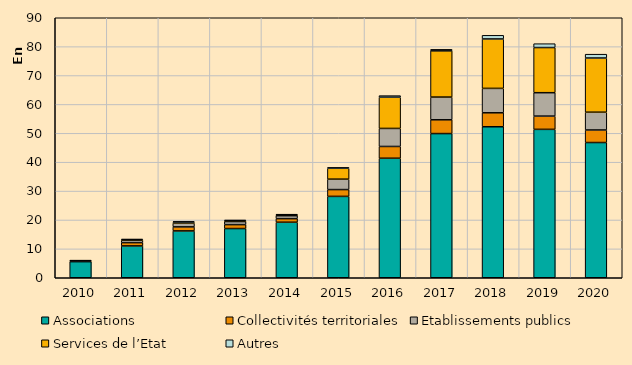
| Category | Associations | Collectivités territoriales | Etablissements publics | Services de l’Etat | Autres |
|---|---|---|---|---|---|
| 2010.0 | 5566 | 251 | 114 | 0 | 77 |
| 2011.0 | 11023 | 1134 | 837 | 180 | 229 |
| 2012.0 | 16215 | 1391 | 1331 | 337 | 208 |
| 2013.0 | 17034 | 1356 | 1069 | 345 | 142 |
| 2014.0 | 19217 | 1243 | 1019 | 355 | 91 |
| 2015.0 | 28167 | 2357 | 3608 | 3763 | 305 |
| 2016.0 | 41376 | 4072 | 6238 | 10824 | 534 |
| 2017.0 | 49910 | 4769 | 7866 | 15999 | 525 |
| 2018.0 | 52267 | 4836 | 8447 | 17112 | 1263 |
| 2019.0 | 51369 | 4585 | 8102 | 15630 | 1337 |
| 2020.0 | 46810 | 4342 | 6153 | 18759 | 1327 |